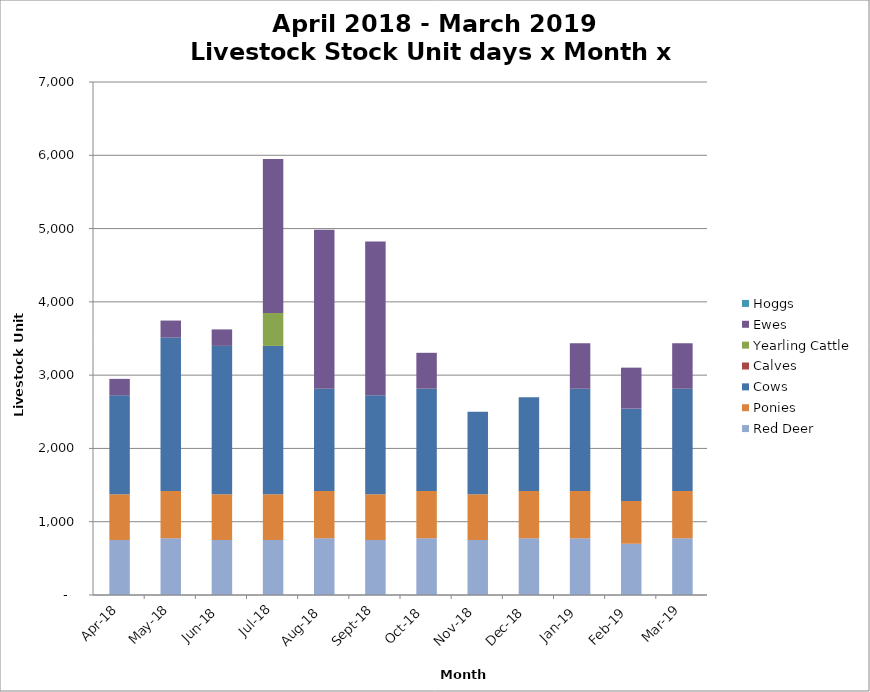
| Category | Red Deer | Ponies | Cows | Calves | Yearling Cattle | Ewes | Hoggs |
|---|---|---|---|---|---|---|---|
| 2018-04-01 | 750 | 624 | 1350 | 0 | 0 | 225 | 0 |
| 2018-05-01 | 775 | 644.8 | 2092.5 | 0 | 0 | 232.5 | 0 |
| 2018-06-01 | 750 | 624 | 2025 | 0 | 0 | 225 | 0 |
| 2018-07-01 | 750 | 624 | 2025 | 0 | 450 | 2100 | 0 |
| 2018-08-01 | 775 | 644.8 | 1395 | 0 | 0 | 2170 | 0 |
| 2018-09-01 | 750 | 624 | 1350 | 0 | 0 | 2100 | 0 |
| 2018-10-01 | 775 | 644.8 | 1395 | 0 | 0 | 490 | 0 |
| 2018-11-01 | 750 | 624 | 1125 | 0 | 0 | 0 | 0 |
| 2018-12-01 | 775 | 644.8 | 1278.75 | 0 | 0 | 0 | 0 |
| 2019-01-01 | 775 | 644.8 | 1395 | 0 | 0 | 620 | 0 |
| 2019-02-01 | 700 | 582.4 | 1260 | 0 | 0 | 560 | 0 |
| 2019-03-01 | 775 | 644.8 | 1395 | 0 | 0 | 620 | 0 |